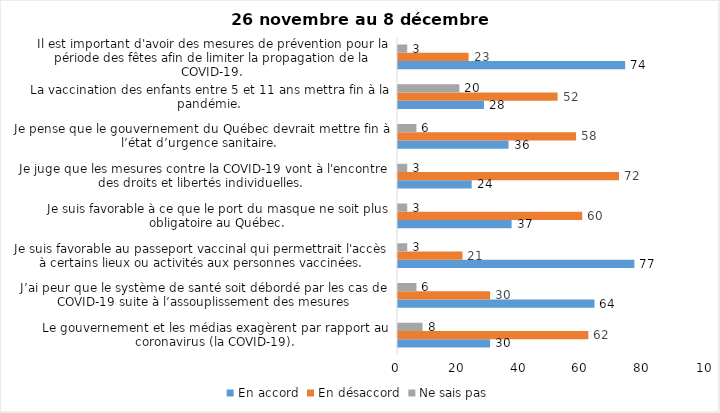
| Category | En accord | En désaccord | Ne sais pas |
|---|---|---|---|
| Le gouvernement et les médias exagèrent par rapport au coronavirus (la COVID-19). | 30 | 62 | 8 |
| J’ai peur que le système de santé soit débordé par les cas de COVID-19 suite à l’assouplissement des mesures | 64 | 30 | 6 |
| Je suis favorable au passeport vaccinal qui permettrait l'accès à certains lieux ou activités aux personnes vaccinées. | 77 | 21 | 3 |
| Je suis favorable à ce que le port du masque ne soit plus obligatoire au Québec. | 37 | 60 | 3 |
| Je juge que les mesures contre la COVID-19 vont à l'encontre des droits et libertés individuelles.  | 24 | 72 | 3 |
| Je pense que le gouvernement du Québec devrait mettre fin à l’état d’urgence sanitaire.  | 36 | 58 | 6 |
| La vaccination des enfants entre 5 et 11 ans mettra fin à la pandémie. | 28 | 52 | 20 |
| Il est important d'avoir des mesures de prévention pour la période des fêtes afin de limiter la propagation de la COVID-19. | 74 | 23 | 3 |